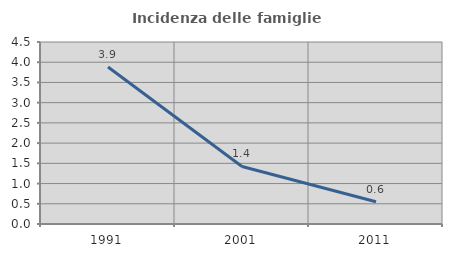
| Category | Incidenza delle famiglie numerose |
|---|---|
| 1991.0 | 3.882 |
| 2001.0 | 1.422 |
| 2011.0 | 0.55 |